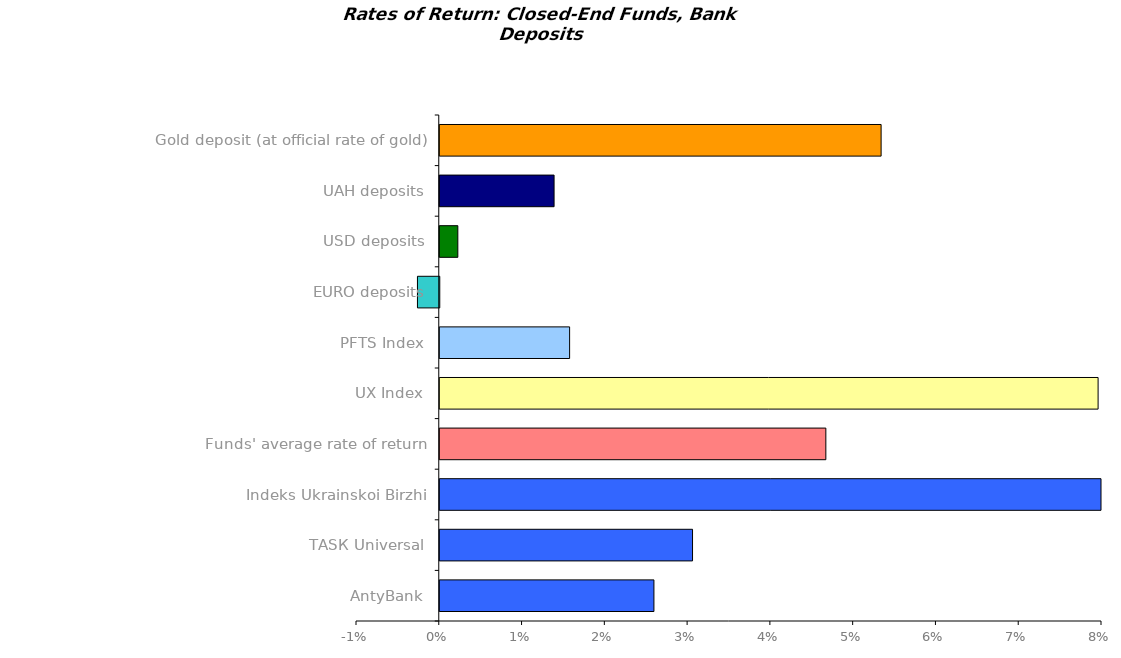
| Category | Series 0 |
|---|---|
| AntyBank | 0.026 |
| ТАSК Universal | 0.031 |
| Indeks Ukrainskoi Birzhi | 0.084 |
| Funds' average rate of return | 0.047 |
| UX Index | 0.08 |
| PFTS Index | 0.016 |
| EURO deposits | -0.003 |
| USD deposits | 0.002 |
| UAH deposits | 0.014 |
| Gold deposit (at official rate of gold) | 0.053 |